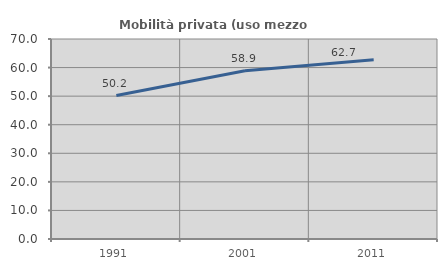
| Category | Mobilità privata (uso mezzo privato) |
|---|---|
| 1991.0 | 50.199 |
| 2001.0 | 58.871 |
| 2011.0 | 62.7 |